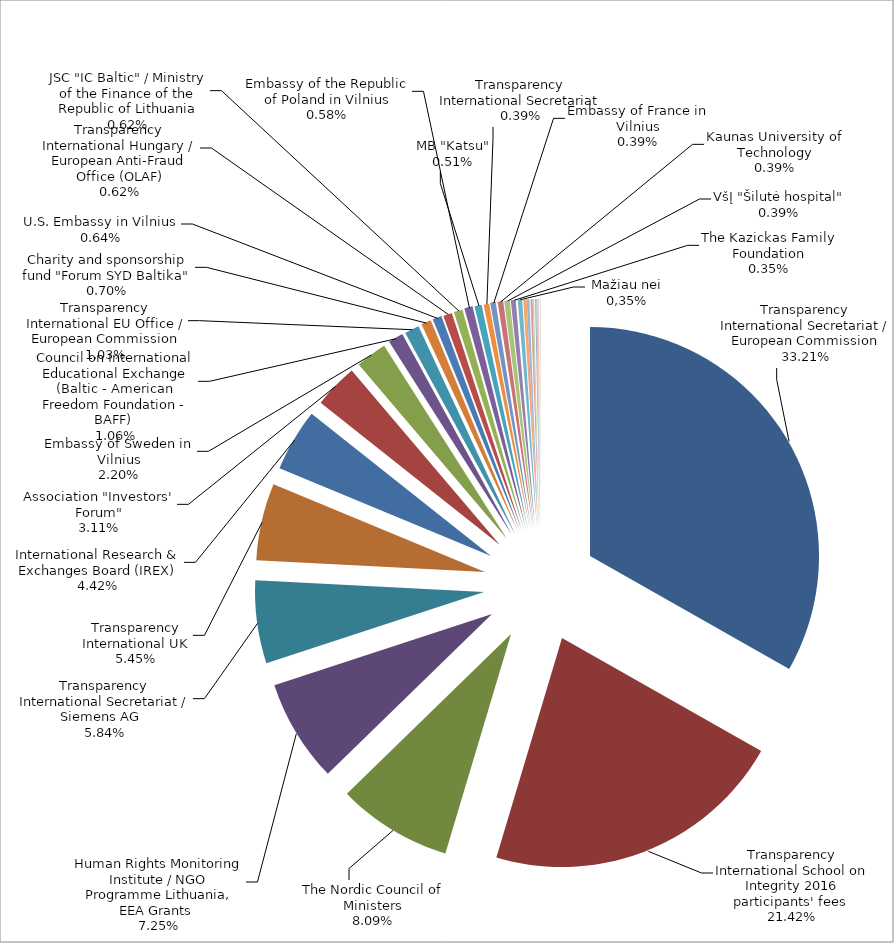
| Category | Series 0 | Series 1 |
|---|---|---|
| Transparency International Secretariat / European Commission | 85322.6 | 0.332 |
| Transparency International School on Integrity 2016 participants' fees  | 55027.97 | 0.214 |
| The Nordic Council of Ministers | 20789.27 | 0.081 |
| Human Rights Monitoring Institute / NGO Programme Lithuania, EEA Grants  | 18631.02 | 0.073 |
| Transparency International Secretariat / Siemens AG   | 15000 | 0.058 |
| Transparency International UK | 14000 | 0.054 |
| International Research & Exchanges Board (IREX) | 11350.49 | 0.044 |
| Association "Investors' Forum" | 8000 | 0.031 |
| Embassy of Sweden in Vilnius | 5641.45 | 0.022 |
| Council on International Educational Exchange (Baltic - American Freedom Foundation - BAFF)  | 2727.44 | 0.011 |
| Transparency International EU Office / European Commission | 2640 | 0.01 |
| Charity and sponsorship fund "Forum SYD Baltika" | 1800 | 0.007 |
| U.S. Embassy in Vilnius | 1655.95 | 0.006 |
| Transparency International Hungary / European Anti-Fraud Office (OLAF) | 1600 | 0.006 |
| JSC "IC Baltic" / Ministry of the Finance of the Republic of Lithuania | 1592.91 | 0.006 |
| Embassy of the Republic of Poland in Vilnius | 1500 | 0.006 |
| MB "Katsu" | 1300 | 0.005 |
| Transparency International Secretariat | 1000 | 0.004 |
| Embassy of France in Vilnius | 1000 | 0.004 |
| Kaunas University of Technology | 1000 | 0.004 |
| VšĮ "Šilutė hospital" | 1000 | 0.004 |
| The Kazickas Family Foundation | 893.42 | 0.003 |
| VšĮ "The Center of Civic, Democracy and Law programs" | 800 | 0.003 |
| Income tax donations | 617.55 | 0.002 |
| IBF International Consulting / European Commission | 500 | 0.002 |
| Tauragė district municipality administration | 400 | 0.002 |
| Other earned funds | 242 | 0.001 |
| Donations by physical persons  | 234 | 0.001 |
| Vilnius College of Design | 200 | 0.001 |
| Lithuanian Police Department under the Ministry of the Interior | 187.5 | 0.001 |
| Vilkaviškis region local action group | 110 | 0 |
| UAB "Vox vera" | 90 | 0 |
| VšĮ "Goodwill Projects" | 69.32 | 0 |